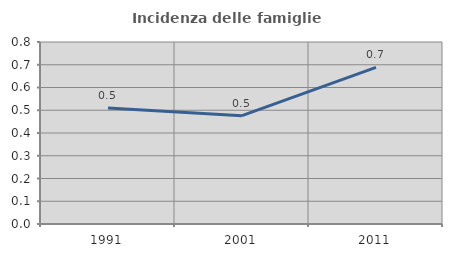
| Category | Incidenza delle famiglie numerose |
|---|---|
| 1991.0 | 0.51 |
| 2001.0 | 0.476 |
| 2011.0 | 0.688 |